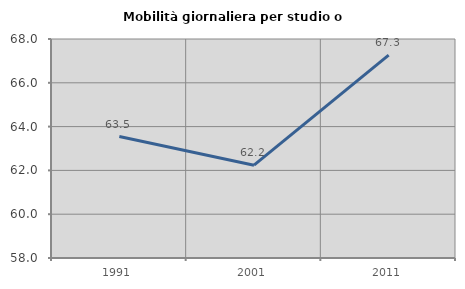
| Category | Mobilità giornaliera per studio o lavoro |
|---|---|
| 1991.0 | 63.547 |
| 2001.0 | 62.237 |
| 2011.0 | 67.264 |